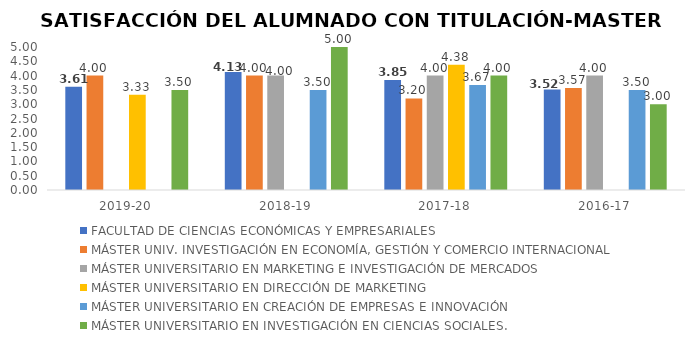
| Category | FACULTAD DE CIENCIAS ECONÓMICAS Y EMPRESARIALES | MÁSTER UNIV. INVESTIGACIÓN EN ECONOMÍA, GESTIÓN Y COMERCIO INTERNACIONAL | MÁSTER UNIVERSITARIO EN MARKETING E INVESTIGACIÓN DE MERCADOS | MÁSTER UNIVERSITARIO EN DIRECCIÓN DE MARKETING | MÁSTER UNIVERSITARIO EN CREACIÓN DE EMPRESAS E INNOVACIÓN | MÁSTER UNIVERSITARIO EN INVESTIGACIÓN EN CIENCIAS SOCIALES. |
|---|---|---|---|---|---|---|
| 2019-20 | 3.61 | 4 | 0 | 3.33 | 0 | 3.5 |
| 2018-19 | 4.125 | 4 | 4 | 0 | 3.5 | 5 |
| 2017-18 | 3.85 | 3.2 | 4 | 4.38 | 3.67 | 4 |
| 2016-17 | 3.518 | 3.57 | 4 | 0 | 3.5 | 3 |